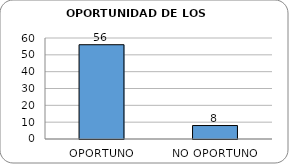
| Category | Series 0 |
|---|---|
| OPORTUNO | 56 |
| NO OPORTUNO | 8 |